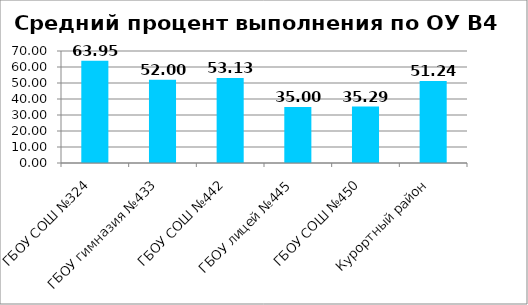
| Category | B4 |
|---|---|
| ГБОУ СОШ №324 | 63.953 |
| ГБОУ гимназия №433 | 52 |
| ГБОУ СОШ №442 | 53.125 |
| ГБОУ лицей №445 | 35 |
| ГБОУ СОШ №450 | 35.294 |
| Курортный район | 51.24 |